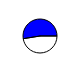
| Category | Series 0 |
|---|---|
| 0 | 7040349 |
| 1 | 7796658 |